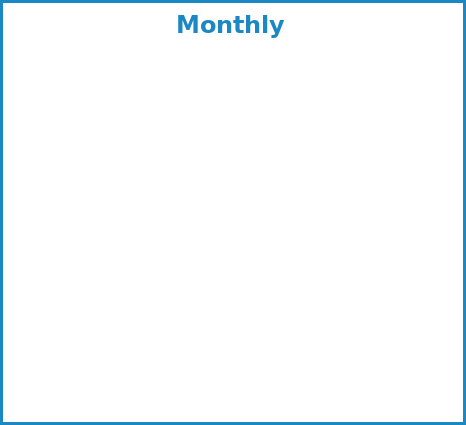
| Category | Series 1 | Series 0 | Series 2 |
|---|---|---|---|
| Utilities: | 0 | 0 | 0 |
| Living: | 0 | 0 | 0 |
| Vehicles: | 0 | 0 | 0 |
| Home: | 0 | 0 | 0 |
| Insurance: | 0 | 0 | 0 |
| Short Term Debt: | 0 | 0 | 0 |
| Saving: | 0 | 0 | 0 |
| Other: | 0 | 0 | 0 |
| Deficit | 0 | 0 | 0 |